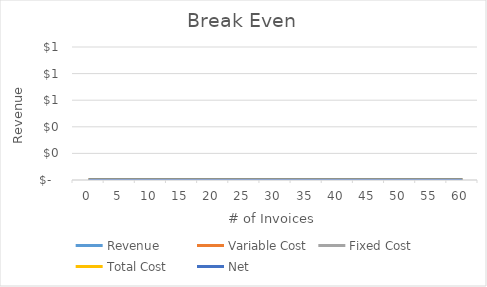
| Category |  Revenue  | Variable Cost |  Fixed Cost  |  Total Cost  | Net |
|---|---|---|---|---|---|
| 0.0 | 0 | 0 | 0 | 0 | 0 |
| 5.0 | 0 | 0 | 0 | 0 | 0 |
| 10.0 | 0 | 0 | 0 | 0 | 0 |
| 15.0 | 0 | 0 | 0 | 0 | 0 |
| 20.0 | 0 | 0 | 0 | 0 | 0 |
| 25.0 | 0 | 0 | 0 | 0 | 0 |
| 30.0 | 0 | 0 | 0 | 0 | 0 |
| 35.0 | 0 | 0 | 0 | 0 | 0 |
| 40.0 | 0 | 0 | 0 | 0 | 0 |
| 45.0 | 0 | 0 | 0 | 0 | 0 |
| 50.0 | 0 | 0 | 0 | 0 | 0 |
| 55.0 | 0 | 0 | 0 | 0 | 0 |
| 60.0 | 0 | 0 | 0 | 0 | 0 |